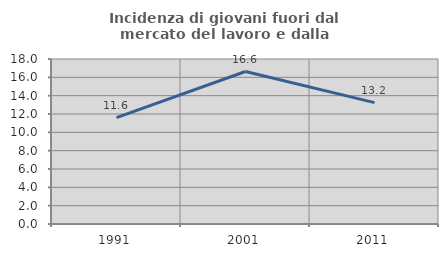
| Category | Incidenza di giovani fuori dal mercato del lavoro e dalla formazione  |
|---|---|
| 1991.0 | 11.597 |
| 2001.0 | 16.634 |
| 2011.0 | 13.245 |